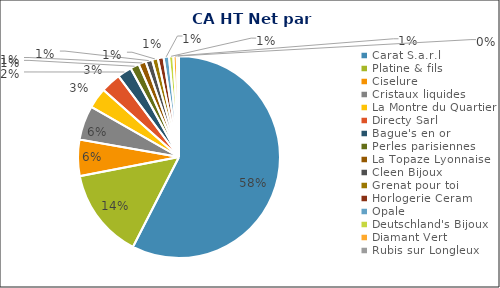
| Category | Total |
|---|---|
| Carat S.a.r.l | 319632.72 |
| Platine & fils | 80180.16 |
| Ciselure | 32232.7 |
| Cristaux liquides | 30489.07 |
| La Montre du Quartier | 18345.32 |
| Directy Sarl | 17906 |
| Bague's en or | 12675 |
| Perles parisiennes | 7844.67 |
| La Topaze Lyonnaise | 6491.32 |
| Cleen Bijoux | 5882.4 |
| Grenat pour toi | 5151.28 |
| Horlogerie Ceram | 5110 |
| Opale | 4812.48 |
| Deutschland's Bijoux | 3848 |
| Diamant Vert | 3048.52 |
| Rubis sur Longleux | 1938.35 |